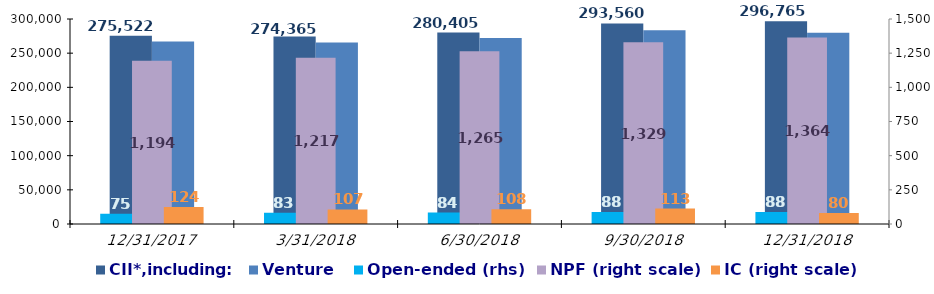
| Category | CII*,including: | Venture |
|---|---|---|
| 12/31/17 | 275522.311 | 267000.791 |
| 3/31/18 | 274364.654 | 265684.134 |
| 6/30/18 | 280405.018 | 272052.334 |
| 9/30/18 | 293559.598 | 283620.683 |
| 12/31/18 | 296765.381 | 279713.253 |